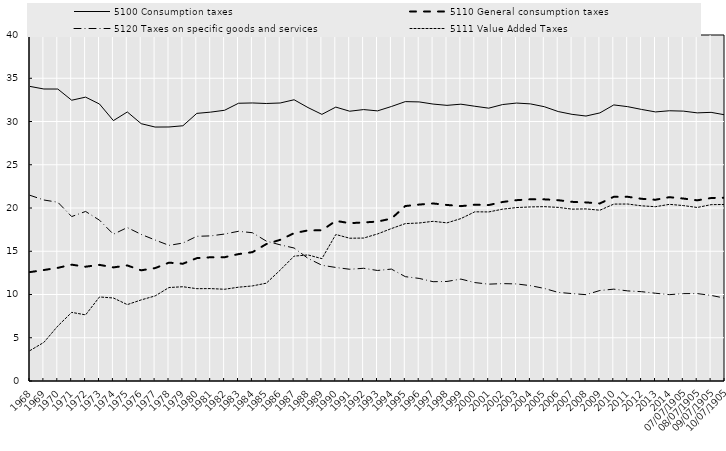
| Category | 5100 Consumption taxes | 5110 General consumption taxes | 5120 Taxes on specific goods and services | 5111 Value Added Taxes |
|---|---|---|---|---|
| 1968 | 34.057 | 12.589 | 21.468 | 3.518 |
| 1969 | 33.757 | 12.832 | 20.925 | 4.467 |
| 1970 | 33.753 | 13.081 | 20.668 | 6.356 |
| 1971 | 32.46 | 13.448 | 19.01 | 7.933 |
| 1972 | 32.817 | 13.214 | 19.601 | 7.646 |
| 1973 | 32.019 | 13.426 | 18.59 | 9.716 |
| 1974 | 30.104 | 13.132 | 16.969 | 9.596 |
| 1975 | 31.102 | 13.359 | 17.74 | 8.832 |
| 1976 | 29.747 | 12.797 | 16.948 | 9.376 |
| 1977 | 29.358 | 13.052 | 16.302 | 9.834 |
| 1978 | 29.366 | 13.681 | 15.681 | 10.807 |
| 1979 | 29.507 | 13.556 | 15.947 | 10.898 |
| 1980 | 30.939 | 14.204 | 16.727 | 10.674 |
| 1981 | 31.084 | 14.305 | 16.777 | 10.683 |
| 1982 | 31.3 | 14.309 | 16.991 | 10.606 |
| 1983 | 32.109 | 14.67 | 17.308 | 10.844 |
| 1984 | 32.143 | 14.893 | 17.141 | 10.992 |
| 1985 | 32.083 | 15.828 | 16.174 | 11.308 |
| 1986 | 32.139 | 16.323 | 15.741 | 12.822 |
| 1987 | 32.513 | 17.092 | 15.375 | 14.436 |
| 1988 | 31.611 | 17.41 | 14.178 | 14.574 |
| 1989 | 30.824 | 17.417 | 13.382 | 14.144 |
| 1990 | 31.664 | 18.514 | 13.126 | 16.938 |
| 1991 | 31.187 | 18.245 | 12.918 | 16.506 |
| 1992 | 31.379 | 18.329 | 13.031 | 16.525 |
| 1993 | 31.227 | 18.43 | 12.777 | 16.998 |
| 1994 | 31.733 | 18.776 | 12.938 | 17.623 |
| 1995 | 32.299 | 20.227 | 12.063 | 18.195 |
| 1996 | 32.264 | 20.397 | 11.861 | 18.268 |
| 1997 | 32.014 | 20.525 | 11.48 | 18.46 |
| 1998 | 31.867 | 20.352 | 11.508 | 18.283 |
| 1999 | 32.002 | 20.214 | 11.782 | 18.775 |
| 2000 | 31.765 | 20.382 | 11.379 | 19.559 |
| 2001 | 31.542 | 20.34 | 11.196 | 19.545 |
| 2002 | 31.959 | 20.694 | 11.26 | 19.864 |
| 2003 | 32.133 | 20.905 | 11.223 | 20.051 |
| 2004 | 32.037 | 21.006 | 11.024 | 20.125 |
| 2005 | 31.711 | 21.001 | 10.703 | 20.153 |
| 2006 | 31.151 | 20.901 | 10.244 | 20.071 |
| 2007 | 30.826 | 20.713 | 10.108 | 19.868 |
| 2008 | 30.631 | 20.646 | 9.979 | 19.895 |
| 2009 | 30.994 | 20.528 | 10.461 | 19.744 |
| 2010 | 31.918 | 21.294 | 10.619 | 20.451 |
| 2011 | 31.716 | 21.296 | 10.416 | 20.46 |
| 2012 | 31.394 | 21.063 | 10.326 | 20.249 |
| 2013 | 31.107 | 20.955 | 10.145 | 20.15 |
| 2014 | 31.241 | 21.252 | 9.983 | 20.423 |
| 2015 | 31.201 | 21.094 | 10.101 | 20.281 |
| 2016 | 30.998 | 20.886 | 10.105 | 20.06 |
| 2017 | 31.057 | 21.154 | 9.897 | 20.386 |
| 2018 | 30.767 | 21.187 | 9.573 | 20.409 |